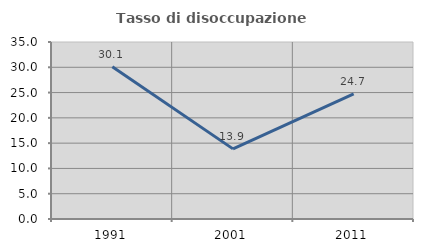
| Category | Tasso di disoccupazione giovanile  |
|---|---|
| 1991.0 | 30.093 |
| 2001.0 | 13.866 |
| 2011.0 | 24.725 |